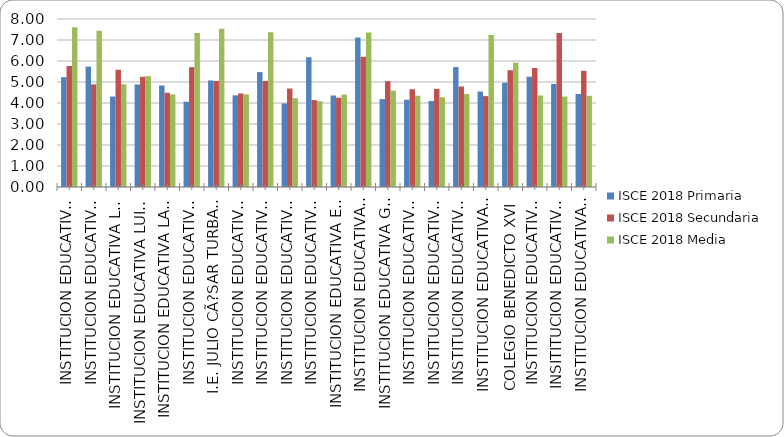
| Category | ISCE 2018 Primaria | ISCE 2018 Secundaria | ISCE 2018 Media |
|---|---|---|---|
| INSTITUCION EDUCATIVA SANTA ANA | 5.23 | 5.762 | 7.605 |
| INSTITUCION EDUCATIVA GENERAL SANTANDER | 5.731 | 4.887 | 7.443 |
| INSTITUCION EDUCATIVA LA DESPENSA | 4.307 | 5.582 | 4.892 |
| INSTITUCION EDUCATIVA LUIS CARLOS GALAN | 4.883 | 5.248 | 5.279 |
| INSTITUCION EDUCATIVA LAS VILLAS | 4.834 | 4.487 | 4.406 |
| INSTITUCION EDUCATIVA INTEGRADO DE SOACHA | 4.058 | 5.706 | 7.338 |
| I.E. JULIO CÃ?SAR TURBAY AYALA | 5.074 | 5.05 | 7.541 |
| INSTITUCION EDUCATIVA EDUARDO SANTOS | 4.364 | 4.452 | 4.408 |
| INSTITUCION EDUCATIVA CIUDAD LATINA | 5.471 | 5.052 | 7.372 |
| INSTITUCION EDUCATIVA CIUDADELA  SUCRE | 3.979 | 4.69 | 4.229 |
| INSTITUCION EDUCATIVA CAZUCA | 6.18 | 4.138 | 4.084 |
| INSTITUCION EDUCATIVA EL BOSQUE | 4.357 | 4.251 | 4.399 |
| INSTITUCION EDUCATIVA  SAN MATEO | 7.119 | 6.198 | 7.358 |
| INSTITUCION EDUCATIVA GABRIEL GARCIA MARQUEZ | 4.186 | 5.039 | 4.591 |
| INSTITUCION EDUCATIVA BUENOS AIRES | 4.155 | 4.655 | 4.348 |
| INSTITUCION EDUCATIVA COMPARTIR | 4.094 | 4.673 | 4.274 |
| INSTITUCION EDUCATIVA LEON XIII | 5.712 | 4.787 | 4.431 |
| INSTITUCION EDUCATIVA  NUEVO COMPARTIR | 4.546 | 4.328 | 7.237 |
| COLEGIO BENEDICTO XVI | 4.964 | 5.561 | 5.918 |
| INSTITUCION EDUCATIVA MANUELA BELTRAN | 5.253 | 5.668 | 4.358 |
| INSITITUCION EDUCATIVA EUGENIO DIAZ CASTRO | 4.908 | 7.33 | 4.308 |
| INSTITUCION EDUCATIVA  RICAURTE | 4.427 | 5.533 | 4.341 |